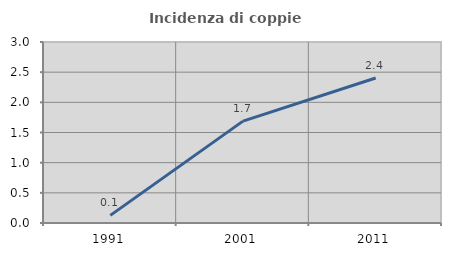
| Category | Incidenza di coppie miste |
|---|---|
| 1991.0 | 0.127 |
| 2001.0 | 1.689 |
| 2011.0 | 2.404 |